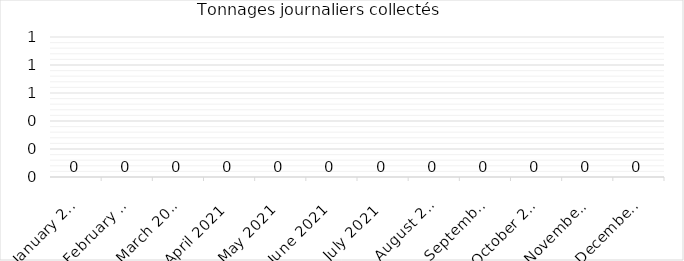
| Category | Tonnage journalier |
|---|---|
| 2021-01-01 | 0 |
| 2021-02-01 | 0 |
| 2021-03-01 | 0 |
| 2021-04-01 | 0 |
| 2021-05-01 | 0 |
| 2021-06-01 | 0 |
| 2021-07-01 | 0 |
| 2021-08-01 | 0 |
| 2021-09-01 | 0 |
| 2021-10-01 | 0 |
| 2021-11-01 | 0 |
| 2021-12-01 | 0 |